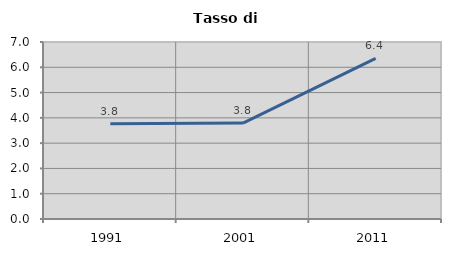
| Category | Tasso di disoccupazione   |
|---|---|
| 1991.0 | 3.764 |
| 2001.0 | 3.793 |
| 2011.0 | 6.355 |